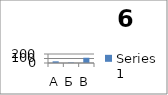
| Category | Series 0 |
|---|---|
| А | 37 |
| Б | 10 |
| В | 117 |